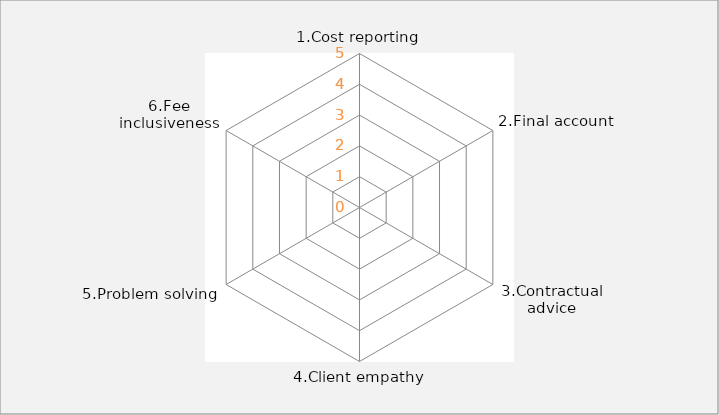
| Category | Series 0 |
|---|---|
| 1.Cost reporting | 0 |
| 2.Final account | 0 |
| 3.Contractual advice | 0 |
| 4.Client empathy | 0 |
| 5.Problem solving | 0 |
| 6.Fee inclusiveness | 0 |